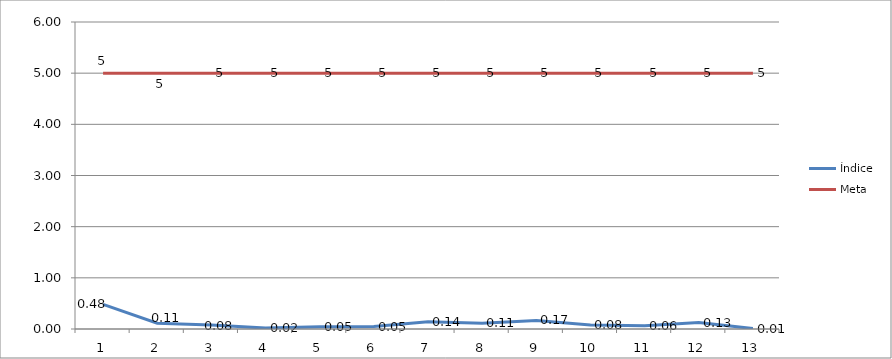
| Category | Índice | Meta |
|---|---|---|
| 0 | 0.48 | 5 |
| 1 | 0.113 | 5 |
| 2 | 0.077 | 5 |
| 3 | 0.019 | 5 |
| 4 | 0.045 | 5 |
| 5 | 0.048 | 5 |
| 6 | 0.143 | 5 |
| 7 | 0.111 | 5 |
| 8 | 0.167 | 5 |
| 9 | 0.077 | 5 |
| 10 | 0.062 | 5 |
| 11 | 0.125 | 5 |
| 12 | 0.009 | 5 |